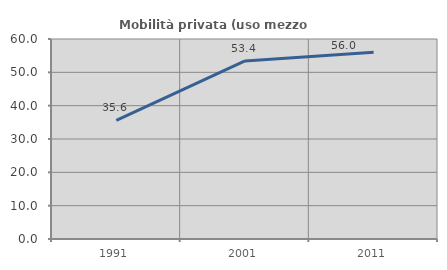
| Category | Mobilità privata (uso mezzo privato) |
|---|---|
| 1991.0 | 35.61 |
| 2001.0 | 53.422 |
| 2011.0 | 56.024 |